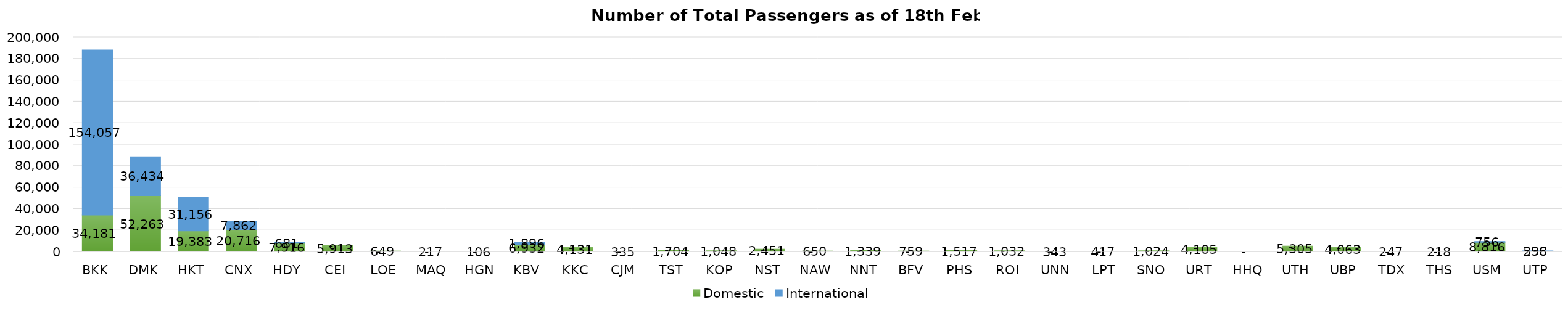
| Category | Domestic | International |
|---|---|---|
| BKK | 34181 | 154057 |
| DMK | 52263 | 36434 |
| HKT | 19383 | 31156 |
| CNX | 20716 | 7862 |
| HDY | 7916 | 681 |
| CEI | 5913 | 0 |
| LOE | 649 | 0 |
| MAQ | 217 | 0 |
| HGN | 106 | 0 |
| KBV | 6932 | 1896 |
| KKC | 4131 | 0 |
| CJM | 335 | 0 |
| TST | 1704 | 0 |
| KOP | 1048 | 0 |
| NST | 2451 | 0 |
| NAW | 650 | 0 |
| NNT | 1339 | 0 |
| BFV | 759 | 0 |
| PHS | 1517 | 0 |
| ROI | 1032 | 0 |
| UNN | 343 | 0 |
| LPT | 417 | 0 |
| SNO | 1024 | 0 |
| URT | 4105 | 0 |
| HHQ | 0 | 0 |
| UTH | 5305 | 0 |
| UBP | 4063 | 0 |
| TDX | 247 | 0 |
| THS | 218 | 0 |
| USM | 8816 | 756 |
| UTP | 596 | 238 |